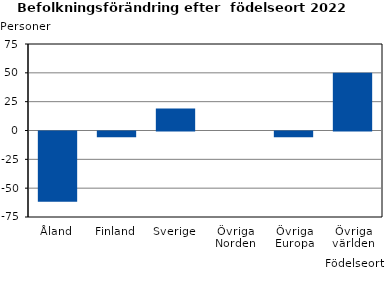
| Category | Series 0 |
|---|---|
| Åland | -61 |
| Finland | -5 |
| Sverige | 19 |
| Övriga Norden | 0 |
| Övriga Europa | -5 |
| Övriga världen | 50 |